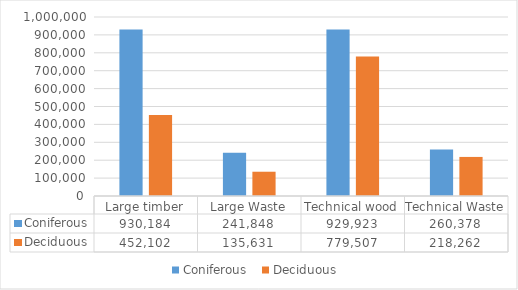
| Category | Coniferous  | Deciduous  |
|---|---|---|
| Large timber | 930184 | 452102 |
| Large Waste | 241848 | 135631 |
| Technical wood | 929923 | 779507 |
| Technical Waste | 260378 | 218262 |